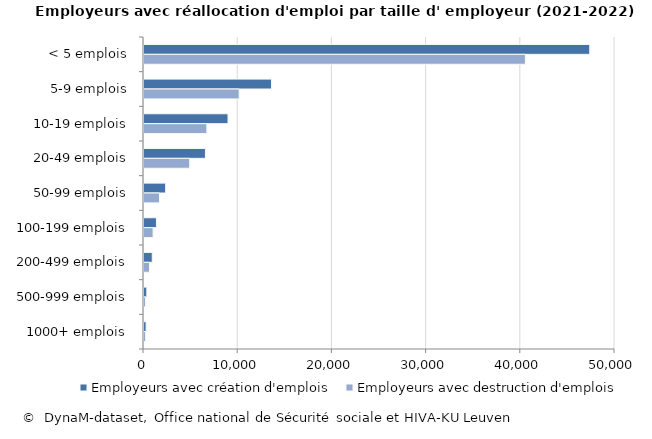
| Category | Employeurs avec création d'emplois | Employeurs avec destruction d'emplois |
|---|---|---|
| < 5 emplois | 47321 | 40487 |
| 5-9 emplois | 13541 | 10103 |
| 10-19 emplois | 8919 | 6674 |
| 20-49 emplois | 6521 | 4853 |
| 50-99 emplois | 2299 | 1648 |
| 100-199 emplois | 1320 | 967 |
| 200-499 emplois | 879 | 581 |
| 500-999 emplois | 299 | 163 |
| 1000+ emplois | 225 | 170 |